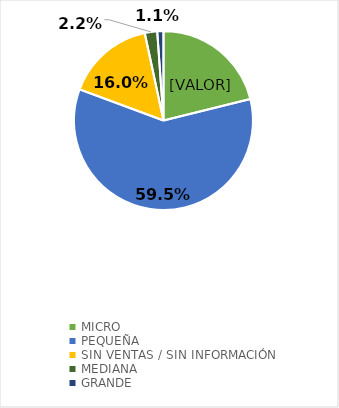
| Category | Series 0 |
|---|---|
| MICRO | 0.211 |
| PEQUEÑA | 0.595 |
| SIN VENTAS / SIN INFORMACIÓN | 0.16 |
| MEDIANA | 0.022 |
| GRANDE | 0.011 |